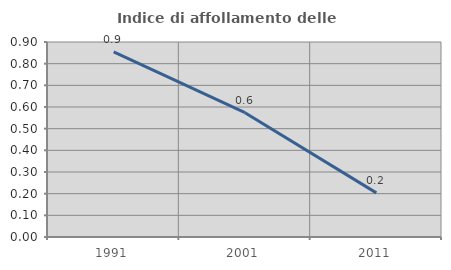
| Category | Indice di affollamento delle abitazioni  |
|---|---|
| 1991.0 | 0.855 |
| 2001.0 | 0.574 |
| 2011.0 | 0.204 |